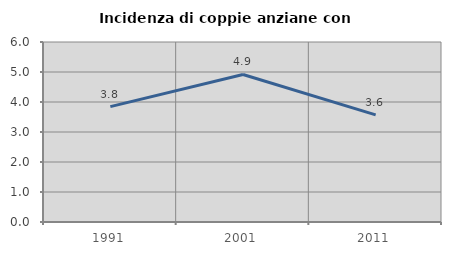
| Category | Incidenza di coppie anziane con figli |
|---|---|
| 1991.0 | 3.846 |
| 2001.0 | 4.918 |
| 2011.0 | 3.571 |